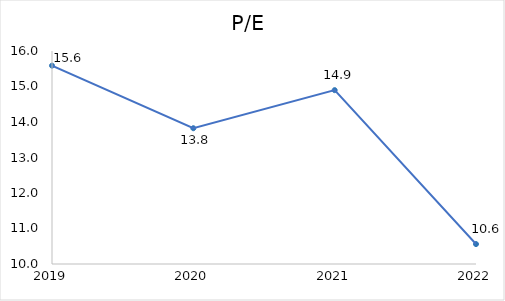
| Category | P/E |
|---|---|
| 2019.0 | 15.587 |
| 2020.0 | 13.825 |
| 2021.0 | 14.897 |
| 2022.0 | 10.561 |